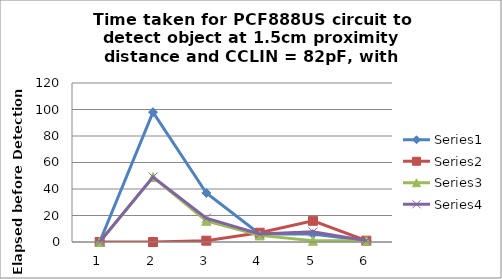
| Category | Series 0 | Series 1 | Series 2 | Series 3 |
|---|---|---|---|---|
| 0 | 0 | 0 | 0 | 0 |
| 1 | 98 | 0 | 49 | 49 |
| 2 | 37 | 1 | 16 | 18 |
| 3 | 6 | 7 | 5 | 6 |
| 4 | 6 | 16 | 1 | 7.667 |
| 5 | 1 | 1 | 1 | 1 |